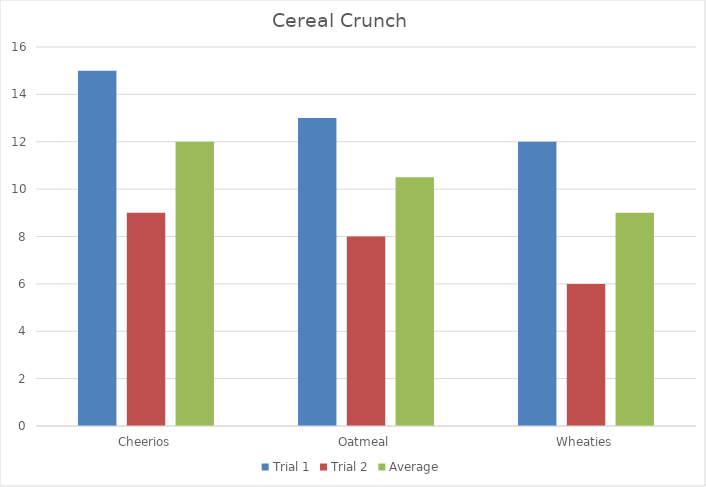
| Category | Trial 1 | Trial 2 | Average |
|---|---|---|---|
| Cheerios | 15 | 9 | 12 |
| Oatmeal | 13 | 8 | 10.5 |
| Wheaties | 12 | 6 | 9 |